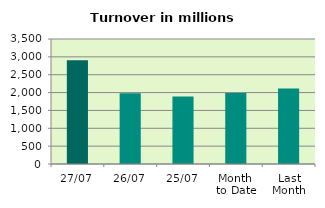
| Category | Series 0 |
|---|---|
| 27/07 | 2907.491 |
| 26/07 | 1979.025 |
| 25/07 | 1888.496 |
| Month 
to Date | 1989.335 |
| Last
Month | 2115.436 |